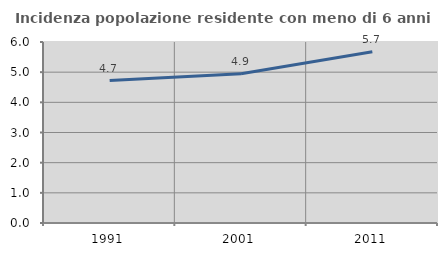
| Category | Incidenza popolazione residente con meno di 6 anni |
|---|---|
| 1991.0 | 4.72 |
| 2001.0 | 4.948 |
| 2011.0 | 5.675 |